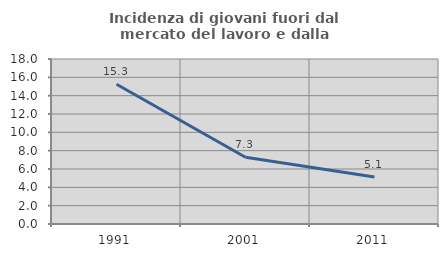
| Category | Incidenza di giovani fuori dal mercato del lavoro e dalla formazione  |
|---|---|
| 1991.0 | 15.25 |
| 2001.0 | 7.289 |
| 2011.0 | 5.119 |